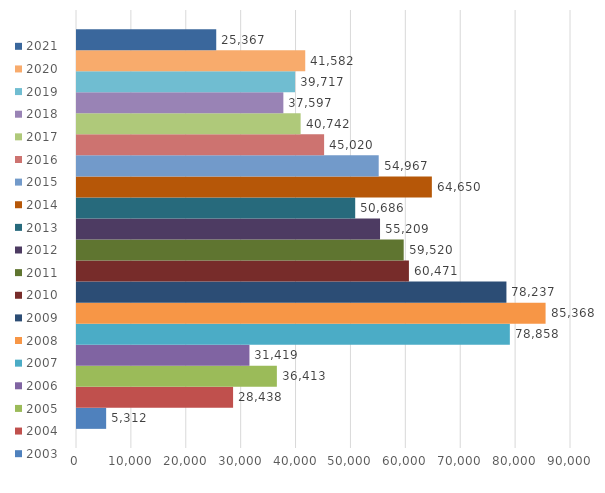
| Category | 2003 | 2004 | 2005 | 2006 | 2007 | 2008 | 2009 | 2010 | 2011 | 2012 | 2013 | 2014 | 2015 | 2016 | 2017 | 2018 | 2019 | 2020 | 2021 |
|---|---|---|---|---|---|---|---|---|---|---|---|---|---|---|---|---|---|---|---|
| 0 | 5312 | 28438 | 36413 | 31419 | 78858 | 85368 | 78237 | 60471 | 59520 | 55209 | 50686 | 64650 | 54967 | 45020 | 40742 | 37597 | 39717 | 41582 | 25367 |